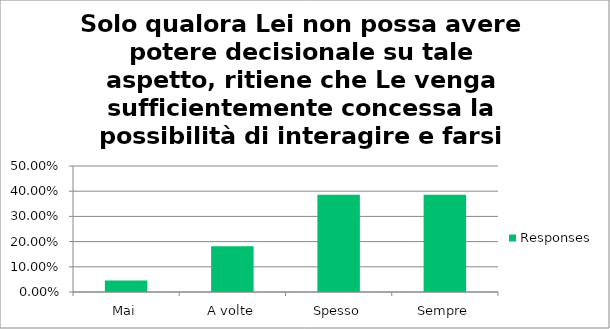
| Category | Responses |
|---|---|
| Mai | 0.046 |
| A volte | 0.182 |
| Spesso | 0.386 |
| Sempre | 0.386 |